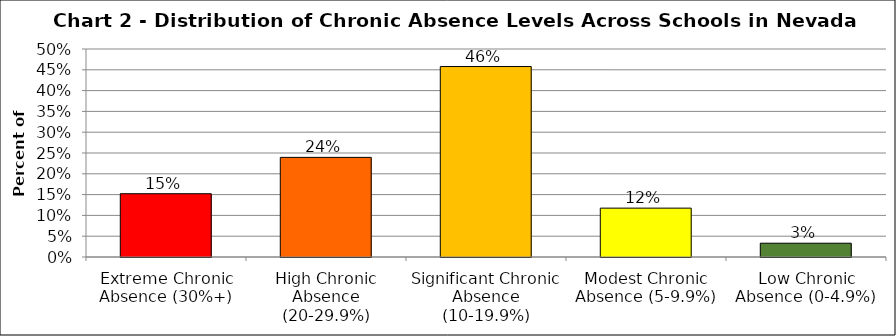
| Category | Series 1 |
|---|---|
| Extreme Chronic Absence (30%+) | 0.152 |
| High Chronic Absence (20-29.9%) | 0.239 |
| Significant Chronic Absence (10-19.9%) | 0.458 |
| Modest Chronic Absence (5-9.9%) | 0.117 |
| Low Chronic Absence (0-4.9%) | 0.033 |